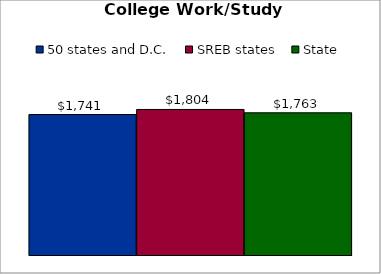
| Category | 50 states and D.C. | SREB states | State |
|---|---|---|---|
| 0 | 1741.305 | 1804.238 | 1762.944 |